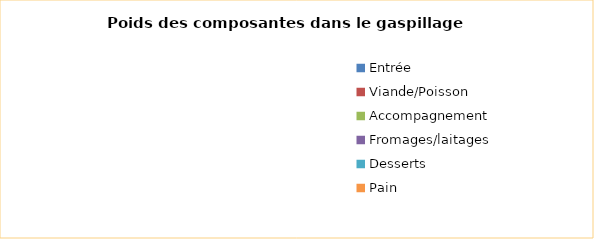
| Category | Series 1 |
|---|---|
| Entrée | 0 |
| Viande/Poisson | 0 |
| Accompagnement | 0 |
| Fromages/laitages | 0 |
| Desserts | 0 |
| Pain | 0 |